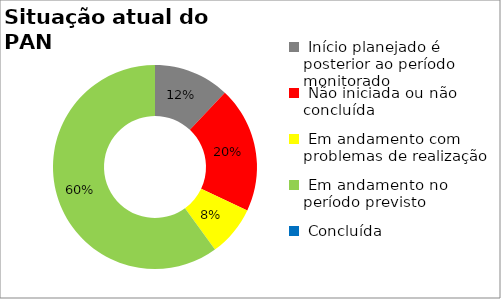
| Category | Series 0 |
|---|---|
|  Início planejado é posterior ao período monitorado | 0.12 |
|  Não iniciada ou não concluída | 0.2 |
|  Em andamento com problemas de realização | 0.08 |
|  Em andamento no período previsto  | 0.6 |
|  Concluída | 0 |